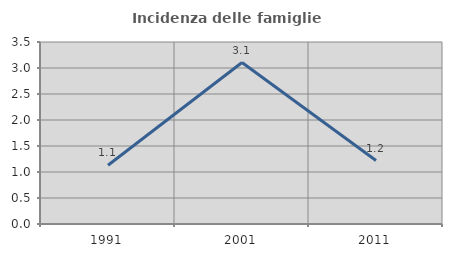
| Category | Incidenza delle famiglie numerose |
|---|---|
| 1991.0 | 1.13 |
| 2001.0 | 3.106 |
| 2011.0 | 1.22 |